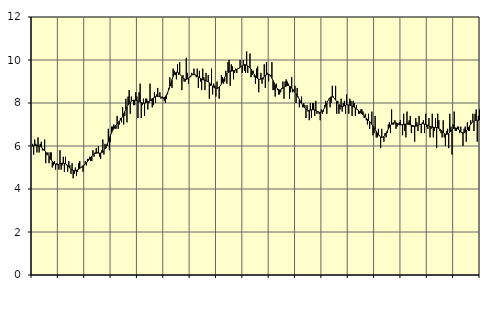
| Category | Piggar | Series 1 |
|---|---|---|
| nan | 6.1 | 5.99 |
| 87.0 | 5.6 | 6.03 |
| 87.0 | 6.3 | 6.03 |
| 87.0 | 6.1 | 6.02 |
| 87.0 | 5.7 | 6.02 |
| 87.0 | 6.4 | 6.01 |
| 87.0 | 5.7 | 6 |
| 87.0 | 6.1 | 5.98 |
| 87.0 | 6.2 | 5.94 |
| 87.0 | 5.8 | 5.9 |
| 87.0 | 5.8 | 5.85 |
| 87.0 | 6.3 | 5.79 |
| nan | 5.2 | 5.72 |
| 88.0 | 5.6 | 5.65 |
| 88.0 | 5.7 | 5.58 |
| 88.0 | 5.2 | 5.5 |
| 88.0 | 5.7 | 5.42 |
| 88.0 | 5.7 | 5.35 |
| 88.0 | 5 | 5.28 |
| 88.0 | 5.1 | 5.23 |
| 88.0 | 5.3 | 5.19 |
| 88.0 | 4.9 | 5.16 |
| 88.0 | 5.2 | 5.15 |
| 88.0 | 5.1 | 5.15 |
| nan | 4.9 | 5.15 |
| 89.0 | 5.8 | 5.17 |
| 89.0 | 4.9 | 5.19 |
| 89.0 | 5.1 | 5.2 |
| 89.0 | 5.5 | 5.2 |
| 89.0 | 4.8 | 5.19 |
| 89.0 | 5.5 | 5.17 |
| 89.0 | 5.1 | 5.14 |
| 89.0 | 4.8 | 5.09 |
| 89.0 | 5.3 | 5.03 |
| 89.0 | 5.1 | 4.97 |
| 89.0 | 4.7 | 4.92 |
| nan | 5.2 | 4.88 |
| 90.0 | 4.5 | 4.86 |
| 90.0 | 4.7 | 4.85 |
| 90.0 | 5 | 4.85 |
| 90.0 | 4.6 | 4.87 |
| 90.0 | 4.8 | 4.89 |
| 90.0 | 5.2 | 4.92 |
| 90.0 | 5.3 | 4.96 |
| 90.0 | 5 | 5 |
| 90.0 | 5 | 5.04 |
| 90.0 | 4.8 | 5.08 |
| 90.0 | 5.1 | 5.12 |
| nan | 5.3 | 5.17 |
| 91.0 | 5.1 | 5.21 |
| 91.0 | 5.4 | 5.27 |
| 91.0 | 5.4 | 5.33 |
| 91.0 | 5.5 | 5.4 |
| 91.0 | 5.3 | 5.47 |
| 91.0 | 5.3 | 5.54 |
| 91.0 | 5.8 | 5.59 |
| 91.0 | 5.5 | 5.63 |
| 91.0 | 5.7 | 5.66 |
| 91.0 | 5.9 | 5.67 |
| 91.0 | 5.7 | 5.67 |
| nan | 6 | 5.67 |
| 92.0 | 5.5 | 5.67 |
| 92.0 | 5.4 | 5.67 |
| 92.0 | 5.8 | 5.69 |
| 92.0 | 6.3 | 5.72 |
| 92.0 | 5.6 | 5.77 |
| 92.0 | 6.1 | 5.86 |
| 92.0 | 5.9 | 5.96 |
| 92.0 | 6 | 6.09 |
| 92.0 | 6.8 | 6.22 |
| 92.0 | 5.8 | 6.36 |
| 92.0 | 6.2 | 6.5 |
| nan | 6.9 | 6.62 |
| 93.0 | 6.9 | 6.73 |
| 93.0 | 7 | 6.83 |
| 93.0 | 6.8 | 6.91 |
| 93.0 | 6.8 | 6.98 |
| 93.0 | 7.4 | 7.04 |
| 93.0 | 6.8 | 7.09 |
| 93.0 | 7 | 7.15 |
| 93.0 | 7.3 | 7.21 |
| 93.0 | 7.1 | 7.28 |
| 93.0 | 7.8 | 7.38 |
| 93.0 | 7 | 7.49 |
| nan | 7.4 | 7.6 |
| 94.0 | 8.2 | 7.71 |
| 94.0 | 7.1 | 7.82 |
| 94.0 | 8.3 | 7.91 |
| 94.0 | 8.6 | 7.98 |
| 94.0 | 7.5 | 8.04 |
| 94.0 | 8.3 | 8.08 |
| 94.0 | 8.1 | 8.11 |
| 94.0 | 7.9 | 8.13 |
| 94.0 | 7.9 | 8.13 |
| 94.0 | 8.5 | 8.13 |
| 94.0 | 8.3 | 8.11 |
| nan | 7.3 | 8.1 |
| 95.0 | 8.5 | 8.07 |
| 95.0 | 8.9 | 8.04 |
| 95.0 | 7.3 | 8.02 |
| 95.0 | 7.9 | 8 |
| 95.0 | 8.2 | 7.99 |
| 95.0 | 7.4 | 8 |
| 95.0 | 8.2 | 8.01 |
| 95.0 | 8.2 | 8.03 |
| 95.0 | 7.7 | 8.06 |
| 95.0 | 8 | 8.09 |
| 95.0 | 8.9 | 8.12 |
| nan | 8.1 | 8.16 |
| 96.0 | 7.8 | 8.2 |
| 96.0 | 7.9 | 8.23 |
| 96.0 | 8.5 | 8.26 |
| 96.0 | 8 | 8.29 |
| 96.0 | 8.4 | 8.31 |
| 96.0 | 8.7 | 8.31 |
| 96.0 | 8.3 | 8.31 |
| 96.0 | 8.5 | 8.29 |
| 96.0 | 8.2 | 8.27 |
| 96.0 | 8.3 | 8.25 |
| 96.0 | 8.2 | 8.24 |
| nan | 8.1 | 8.25 |
| 97.0 | 8 | 8.3 |
| 97.0 | 8.2 | 8.38 |
| 97.0 | 8.4 | 8.49 |
| 97.0 | 8.7 | 8.62 |
| 97.0 | 9.2 | 8.78 |
| 97.0 | 8.8 | 8.94 |
| 97.0 | 8.7 | 9.09 |
| 97.0 | 9.6 | 9.23 |
| 97.0 | 9.5 | 9.33 |
| 97.0 | 9.3 | 9.4 |
| 97.0 | 9.1 | 9.43 |
| nan | 9.8 | 9.43 |
| 98.0 | 9.3 | 9.4 |
| 98.0 | 9.9 | 9.35 |
| 98.0 | 9.3 | 9.29 |
| 98.0 | 8.6 | 9.22 |
| 98.0 | 9.3 | 9.16 |
| 98.0 | 9 | 9.12 |
| 98.0 | 9 | 9.1 |
| 98.0 | 10.1 | 9.1 |
| 98.0 | 9.4 | 9.12 |
| 98.0 | 8.9 | 9.16 |
| 98.0 | 9.2 | 9.21 |
| nan | 9.2 | 9.26 |
| 99.0 | 9.4 | 9.3 |
| 99.0 | 9.3 | 9.32 |
| 99.0 | 9.6 | 9.32 |
| 99.0 | 9.3 | 9.31 |
| 99.0 | 9.2 | 9.29 |
| 99.0 | 9.6 | 9.25 |
| 99.0 | 8.7 | 9.22 |
| 99.0 | 9.5 | 9.18 |
| 99.0 | 9 | 9.15 |
| 99.0 | 8.6 | 9.11 |
| 99.0 | 9.6 | 9.09 |
| nan | 9.2 | 9.07 |
| 0.0 | 8.6 | 9.05 |
| 0.0 | 9.4 | 9.03 |
| 0.0 | 9 | 9.01 |
| 0.0 | 9.3 | 8.98 |
| 0.0 | 8.2 | 8.94 |
| 0.0 | 8.8 | 8.89 |
| 0.0 | 9.6 | 8.83 |
| 0.0 | 8.4 | 8.78 |
| 0.0 | 8.9 | 8.74 |
| 0.0 | 8.8 | 8.7 |
| 0.0 | 8.3 | 8.69 |
| nan | 9 | 8.68 |
| 1.0 | 8.7 | 8.7 |
| 1.0 | 8.2 | 8.74 |
| 1.0 | 8.8 | 8.8 |
| 1.0 | 9.3 | 8.88 |
| 1.0 | 9.2 | 8.98 |
| 1.0 | 8.9 | 9.09 |
| 1.0 | 9 | 9.19 |
| 1.0 | 9.5 | 9.28 |
| 1.0 | 8.9 | 9.36 |
| 1.0 | 9.9 | 9.42 |
| 1.0 | 10 | 9.45 |
| nan | 8.8 | 9.48 |
| 2.0 | 9.8 | 9.48 |
| 2.0 | 9.7 | 9.49 |
| 2.0 | 9.1 | 9.5 |
| 2.0 | 9.4 | 9.51 |
| 2.0 | 9.6 | 9.53 |
| 2.0 | 9.4 | 9.55 |
| 2.0 | 9.6 | 9.58 |
| 2.0 | 9.6 | 9.62 |
| 2.0 | 10 | 9.66 |
| 2.0 | 9.7 | 9.7 |
| 2.0 | 9.4 | 9.73 |
| nan | 10 | 9.76 |
| 3.0 | 9.5 | 9.78 |
| 3.0 | 9.4 | 9.78 |
| 3.0 | 10.4 | 9.76 |
| 3.0 | 9.4 | 9.73 |
| 3.0 | 9.7 | 9.69 |
| 3.0 | 10.3 | 9.63 |
| 3.0 | 9.2 | 9.57 |
| 3.0 | 9.3 | 9.49 |
| 3.0 | 9.5 | 9.41 |
| 3.0 | 9.2 | 9.33 |
| 3.0 | 8.9 | 9.25 |
| nan | 9.6 | 9.18 |
| 4.0 | 9.7 | 9.13 |
| 4.0 | 8.5 | 9.11 |
| 4.0 | 9.1 | 9.1 |
| 4.0 | 9.4 | 9.11 |
| 4.0 | 8.9 | 9.14 |
| 4.0 | 9.1 | 9.18 |
| 4.0 | 9.8 | 9.23 |
| 4.0 | 8.7 | 9.28 |
| 4.0 | 9.9 | 9.31 |
| 4.0 | 9.4 | 9.34 |
| 4.0 | 9 | 9.34 |
| nan | 9.3 | 9.31 |
| 5.0 | 9.3 | 9.24 |
| 5.0 | 9.9 | 9.15 |
| 5.0 | 8.6 | 9.05 |
| 5.0 | 8.6 | 8.94 |
| 5.0 | 8.3 | 8.83 |
| 5.0 | 8.9 | 8.73 |
| 5.0 | 8.6 | 8.66 |
| 5.0 | 8.4 | 8.62 |
| 5.0 | 8.4 | 8.61 |
| 5.0 | 8.5 | 8.61 |
| 5.0 | 8.7 | 8.65 |
| nan | 9 | 8.69 |
| 6.0 | 8.2 | 8.73 |
| 6.0 | 9 | 8.77 |
| 6.0 | 9.1 | 8.79 |
| 6.0 | 9 | 8.81 |
| 6.0 | 8.9 | 8.81 |
| 6.0 | 8.2 | 8.78 |
| 6.0 | 8.5 | 8.75 |
| 6.0 | 9.2 | 8.7 |
| 6.0 | 8.5 | 8.64 |
| 6.0 | 8.6 | 8.57 |
| 6.0 | 8.8 | 8.5 |
| nan | 8 | 8.42 |
| 7.0 | 8.7 | 8.34 |
| 7.0 | 8.3 | 8.26 |
| 7.0 | 7.8 | 8.17 |
| 7.0 | 8 | 8.08 |
| 7.0 | 8.3 | 7.98 |
| 7.0 | 7.8 | 7.9 |
| 7.0 | 8 | 7.82 |
| 7.0 | 7.9 | 7.76 |
| 7.0 | 7.3 | 7.71 |
| 7.0 | 7.9 | 7.68 |
| 7.0 | 7.6 | 7.66 |
| nan | 7.2 | 7.66 |
| 8.0 | 8 | 7.67 |
| 8.0 | 7.3 | 7.68 |
| 8.0 | 8 | 7.69 |
| 8.0 | 8 | 7.69 |
| 8.0 | 7.4 | 7.68 |
| 8.0 | 8.1 | 7.65 |
| 8.0 | 7.5 | 7.62 |
| 8.0 | 7.6 | 7.59 |
| 8.0 | 7.5 | 7.57 |
| 8.0 | 7.2 | 7.56 |
| 8.0 | 7.7 | 7.58 |
| nan | 7.5 | 7.62 |
| 9.0 | 7.6 | 7.69 |
| 9.0 | 7.9 | 7.78 |
| 9.0 | 8.1 | 7.89 |
| 9.0 | 7.5 | 7.99 |
| 9.0 | 8.1 | 8.1 |
| 9.0 | 8.2 | 8.19 |
| 9.0 | 7.8 | 8.25 |
| 9.0 | 8 | 8.29 |
| 9.0 | 8.8 | 8.29 |
| 9.0 | 8.3 | 8.26 |
| 9.0 | 8.2 | 8.21 |
| nan | 8.8 | 8.14 |
| 10.0 | 7.5 | 8.07 |
| 10.0 | 8.1 | 7.99 |
| 10.0 | 7.5 | 7.93 |
| 10.0 | 7.7 | 7.88 |
| 10.0 | 8.2 | 7.85 |
| 10.0 | 7.6 | 7.84 |
| 10.0 | 8 | 7.85 |
| 10.0 | 8.1 | 7.87 |
| 10.0 | 7.5 | 7.89 |
| 10.0 | 8.4 | 7.91 |
| 10.0 | 7.9 | 7.92 |
| nan | 7.5 | 7.91 |
| 11.0 | 8.2 | 7.9 |
| 11.0 | 8.1 | 7.89 |
| 11.0 | 7.4 | 7.86 |
| 11.0 | 8.1 | 7.84 |
| 11.0 | 8 | 7.8 |
| 11.0 | 7.4 | 7.77 |
| 11.0 | 7.9 | 7.72 |
| 11.0 | 7.7 | 7.68 |
| 11.0 | 7.5 | 7.64 |
| 11.0 | 7.5 | 7.59 |
| 11.0 | 7.7 | 7.54 |
| nan | 7.7 | 7.49 |
| 12.0 | 7.6 | 7.45 |
| 12.0 | 7.3 | 7.4 |
| 12.0 | 7.5 | 7.35 |
| 12.0 | 7.2 | 7.3 |
| 12.0 | 7 | 7.25 |
| 12.0 | 7.5 | 7.19 |
| 12.0 | 6.8 | 7.14 |
| 12.0 | 7.1 | 7.07 |
| 12.0 | 7.6 | 7 |
| 12.0 | 6.5 | 6.93 |
| 12.0 | 6.6 | 6.85 |
| nan | 7.4 | 6.77 |
| 13.0 | 6.4 | 6.68 |
| 13.0 | 6.4 | 6.6 |
| 13.0 | 6.8 | 6.52 |
| 13.0 | 6.5 | 6.46 |
| 13.0 | 5.9 | 6.42 |
| 13.0 | 6.8 | 6.4 |
| 13.0 | 6.4 | 6.41 |
| 13.0 | 6.2 | 6.45 |
| 13.0 | 6.6 | 6.51 |
| 13.0 | 6.4 | 6.6 |
| 13.0 | 6.6 | 6.69 |
| nan | 7 | 6.79 |
| 14.0 | 7.1 | 6.88 |
| 14.0 | 6.6 | 6.96 |
| 14.0 | 7.7 | 7.02 |
| 14.0 | 7 | 7.06 |
| 14.0 | 7 | 7.08 |
| 14.0 | 7.2 | 7.09 |
| 14.0 | 6.8 | 7.08 |
| 14.0 | 6.9 | 7.05 |
| 14.0 | 7 | 7.03 |
| 14.0 | 7.1 | 7 |
| 14.0 | 7.2 | 6.99 |
| nan | 7 | 6.98 |
| 15.0 | 6.5 | 6.99 |
| 15.0 | 7.5 | 7 |
| 15.0 | 6.7 | 7.01 |
| 15.0 | 6.4 | 7.02 |
| 15.0 | 7.6 | 7.02 |
| 15.0 | 7.1 | 7.02 |
| 15.0 | 7.2 | 7 |
| 15.0 | 7.4 | 6.99 |
| 15.0 | 6.6 | 6.97 |
| 15.0 | 6.9 | 6.95 |
| 15.0 | 6.9 | 6.94 |
| nan | 6.2 | 6.93 |
| 16.0 | 7.3 | 6.92 |
| 16.0 | 7.1 | 6.93 |
| 16.0 | 6.7 | 6.95 |
| 16.0 | 7.4 | 6.98 |
| 16.0 | 7 | 7 |
| 16.0 | 6.6 | 7.02 |
| 16.0 | 7.1 | 7.03 |
| 16.0 | 7.2 | 7.03 |
| 16.0 | 6.6 | 7.02 |
| 16.0 | 7.5 | 7.01 |
| 16.0 | 6.9 | 6.99 |
| nan | 6.8 | 6.96 |
| 17.0 | 7.3 | 6.94 |
| 17.0 | 6.4 | 6.91 |
| 17.0 | 6.8 | 6.89 |
| 17.0 | 7.5 | 6.87 |
| 17.0 | 6.4 | 6.87 |
| 17.0 | 6.7 | 6.87 |
| 17.0 | 7.3 | 6.87 |
| 17.0 | 5.9 | 6.86 |
| 17.0 | 7.5 | 6.85 |
| 17.0 | 7.2 | 6.82 |
| 17.0 | 6.7 | 6.78 |
| nan | 6.6 | 6.73 |
| 18.0 | 6.4 | 6.68 |
| 18.0 | 7.2 | 6.63 |
| 18.0 | 6.4 | 6.58 |
| 18.0 | 6 | 6.55 |
| 18.0 | 6.7 | 6.54 |
| 18.0 | 6.8 | 6.56 |
| 18.0 | 5.9 | 6.59 |
| 18.0 | 7.5 | 6.64 |
| 18.0 | 6.9 | 6.7 |
| 18.0 | 5.6 | 6.76 |
| 18.0 | 7 | 6.8 |
| nan | 7.6 | 6.83 |
| 19.0 | 6.7 | 6.84 |
| 19.0 | 6.7 | 6.83 |
| 19.0 | 6.9 | 6.8 |
| 19.0 | 6.9 | 6.76 |
| 19.0 | 6.6 | 6.72 |
| 19.0 | 6.9 | 6.67 |
| 19.0 | 6.6 | 6.63 |
| 19.0 | 6 | 6.61 |
| 19.0 | 6.8 | 6.61 |
| 19.0 | 6.9 | 6.64 |
| 19.0 | 6.2 | 6.69 |
| nan | 7.1 | 6.77 |
| 20.0 | 6.7 | 6.85 |
| 20.0 | 6.7 | 6.93 |
| 20.0 | 7.2 | 7.01 |
| 20.0 | 7.1 | 7.08 |
| 20.0 | 7.5 | 7.13 |
| 20.0 | 6.7 | 7.16 |
| 20.0 | 7.5 | 7.18 |
| 20.0 | 7.7 | 7.19 |
| 20.0 | 6.2 | 7.19 |
| 20.0 | 7.4 | 7.2 |
| 20.0 | 7.7 | 7.2 |